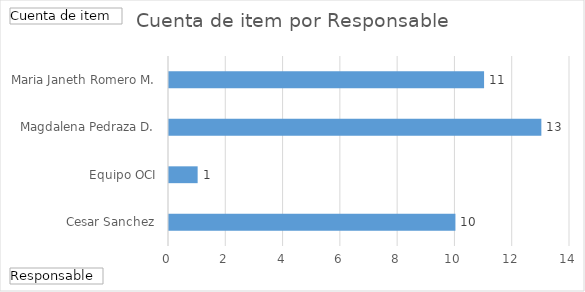
| Category | Total |
|---|---|
| Cesar Sanchez | 10 |
| Equipo OCI | 1 |
| Magdalena Pedraza D. | 13 |
| Maria Janeth Romero M. | 11 |